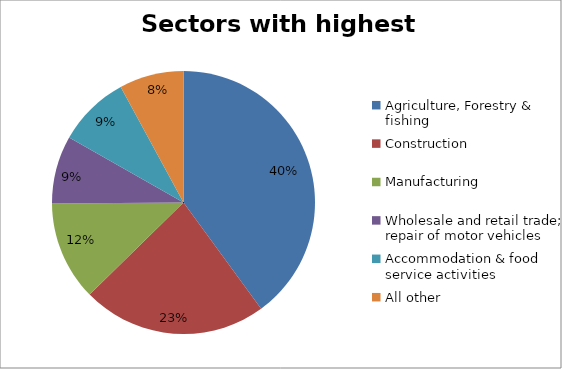
| Category | Sectors with highest totals | Percentage |
|---|---|---|
| Agriculture, Forestry & fishing | 79975 | 0.4 |
| Construction | 45448 | 0.227 |
| Manufacturing | 24487 | 0.122 |
| Wholesale and retail trade; repair of motor vehicles  | 16674 | 0.083 |
| Accommodation & food service activities | 17734 | 0.089 |
| All other | 15862 | 0.079 |